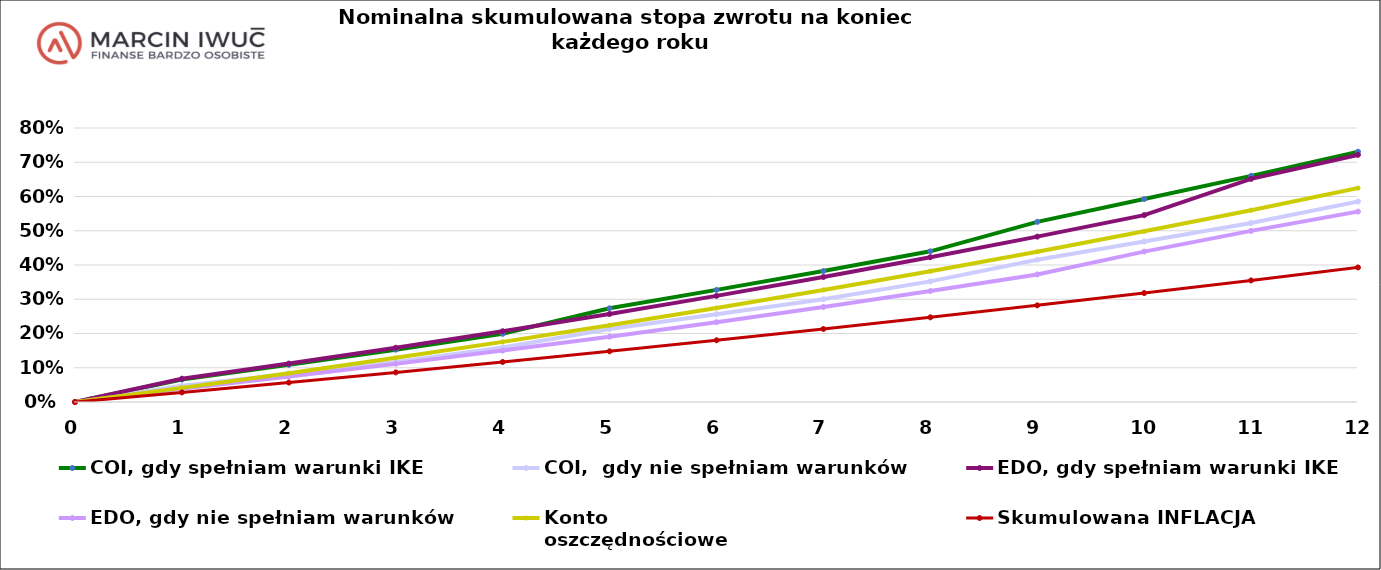
| Category | COI, gdy spełniam warunki IKE | COI,  gdy nie spełniam warunków | EDO, gdy spełniam warunki IKE | EDO, gdy nie spełniam warunków | Konto
oszczędnościowe | Skumulowana INFLACJA |
|---|---|---|---|---|---|---|
| 0.0 | 0 | 0 | 0 | 0 | 0 | 0 |
| 1.0 | 0.066 | 0.047 | 0.068 | 0.039 | 0.041 | 0.028 |
| 2.0 | 0.108 | 0.081 | 0.112 | 0.074 | 0.084 | 0.057 |
| 3.0 | 0.153 | 0.117 | 0.158 | 0.111 | 0.129 | 0.086 |
| 4.0 | 0.199 | 0.159 | 0.207 | 0.15 | 0.176 | 0.117 |
| 5.0 | 0.274 | 0.213 | 0.257 | 0.191 | 0.224 | 0.148 |
| 6.0 | 0.327 | 0.256 | 0.31 | 0.233 | 0.275 | 0.18 |
| 7.0 | 0.382 | 0.3 | 0.365 | 0.278 | 0.327 | 0.213 |
| 8.0 | 0.44 | 0.352 | 0.423 | 0.324 | 0.382 | 0.247 |
| 9.0 | 0.526 | 0.415 | 0.483 | 0.372 | 0.439 | 0.282 |
| 10.0 | 0.593 | 0.468 | 0.546 | 0.439 | 0.498 | 0.318 |
| 11.0 | 0.66 | 0.523 | 0.652 | 0.5 | 0.56 | 0.355 |
| 12.0 | 0.731 | 0.585 | 0.722 | 0.556 | 0.624 | 0.393 |